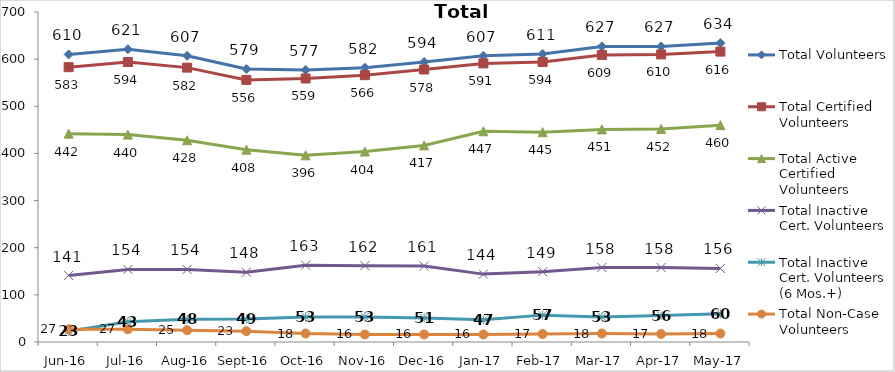
| Category | Total Volunteers | Total Certified Volunteers | Total Active Certified Volunteers | Total Inactive Cert. Volunteers | Total Inactive Cert. Volunteers (6 Mos.+) | Total Non-Case Volunteers |
|---|---|---|---|---|---|---|
| Jun-16 | 610 | 583 | 442 | 141 | 23 | 27 |
| Jul-16 | 621 | 594 | 440 | 154 | 43 | 27 |
| Aug-16 | 607 | 582 | 428 | 154 | 48 | 25 |
| Sep-16 | 579 | 556 | 408 | 148 | 49 | 23 |
| Oct-16 | 577 | 559 | 396 | 163 | 53 | 18 |
| Nov-16 | 582 | 566 | 404 | 162 | 53 | 16 |
| Dec-16 | 594 | 578 | 417 | 161 | 51 | 16 |
| Jan-17 | 607 | 591 | 447 | 144 | 47 | 16 |
| Feb-17 | 611 | 594 | 445 | 149 | 57 | 17 |
| Mar-17 | 627 | 609 | 451 | 158 | 53 | 18 |
| Apr-17 | 627 | 610 | 452 | 158 | 56 | 17 |
| May-17 | 634 | 616 | 460 | 156 | 60 | 18 |